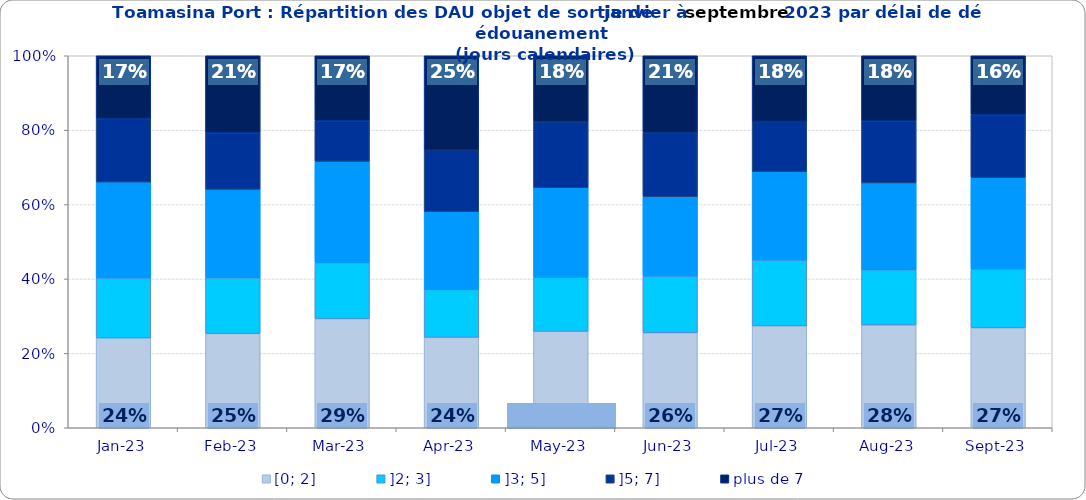
| Category | [0; 2] | ]2; 3] | ]3; 5] | ]5; 7] | plus de 7 |
|---|---|---|---|---|---|
| 2023-01-01 | 0.242 | 0.161 | 0.258 | 0.171 | 0.169 |
| 2023-02-01 | 0.253 | 0.15 | 0.238 | 0.152 | 0.207 |
| 2023-03-01 | 0.293 | 0.151 | 0.272 | 0.109 | 0.175 |
| 2023-04-01 | 0.243 | 0.129 | 0.209 | 0.165 | 0.254 |
| 2023-05-01 | 0.259 | 0.146 | 0.24 | 0.178 | 0.177 |
| 2023-06-01 | 0.255 | 0.152 | 0.213 | 0.173 | 0.206 |
| 2023-07-01 | 0.274 | 0.177 | 0.238 | 0.135 | 0.177 |
| 2023-08-01 | 0.276 | 0.148 | 0.233 | 0.166 | 0.175 |
| 2023-09-01 | 0.269 | 0.158 | 0.246 | 0.169 | 0.158 |